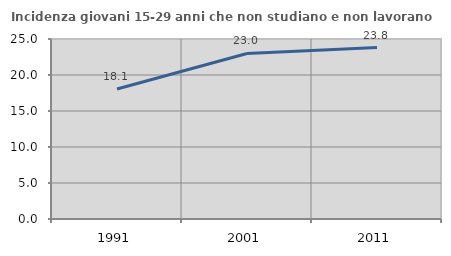
| Category | Incidenza giovani 15-29 anni che non studiano e non lavorano  |
|---|---|
| 1991.0 | 18.052 |
| 2001.0 | 22.989 |
| 2011.0 | 23.81 |